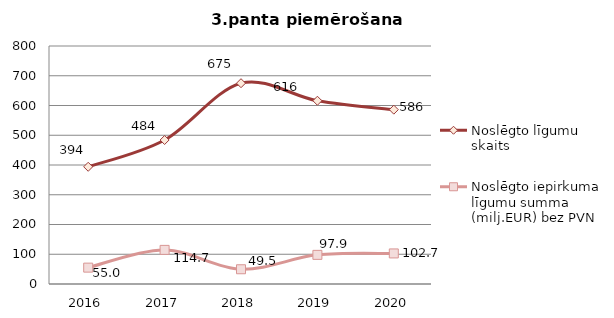
| Category | Noslēgto līgumu skaits | Noslēgto iepirkuma līgumu summa (milj.EUR) bez PVN |
|---|---|---|
| 2016.0 | 394 | 54.993 |
| 2017.0 | 484 | 114.654 |
| 2018.0 | 675 | 49.536 |
| 2019.0 | 616 | 97.928 |
| 2020.0 | 586 | 102.745 |